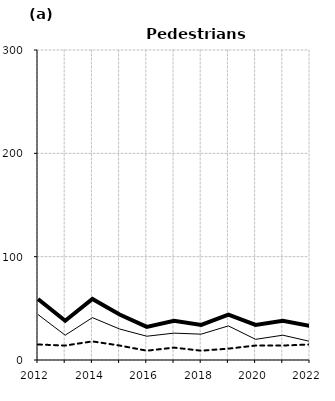
| Category | Built-up | Non built-up | Total |
|---|---|---|---|
| 2012.0 | 44 | 15 | 59 |
| 2013.0 | 24 | 14 | 38 |
| 2014.0 | 41 | 18 | 59 |
| 2015.0 | 30 | 14 | 44 |
| 2016.0 | 23 | 9 | 32 |
| 2017.0 | 26 | 12 | 38 |
| 2018.0 | 25 | 9 | 34 |
| 2019.0 | 33 | 11 | 44 |
| 2020.0 | 20 | 14 | 34 |
| 2021.0 | 24 | 14 | 38 |
| 2022.0 | 18 | 15 | 33 |